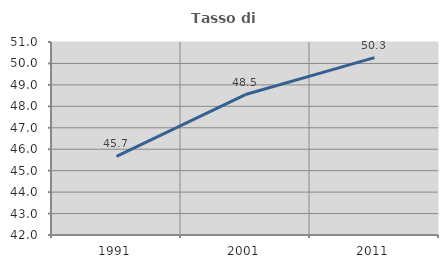
| Category | Tasso di occupazione   |
|---|---|
| 1991.0 | 45.671 |
| 2001.0 | 48.549 |
| 2011.0 | 50.271 |